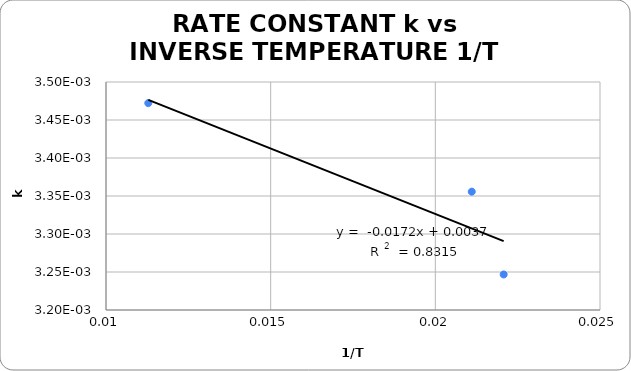
| Category | Invsere Temperature |
|---|---|
| 0.011284134506883323 | 0.003 |
| 0.021105951878429716 | 0.003 |
| 0.02207505518763797 | 0.003 |